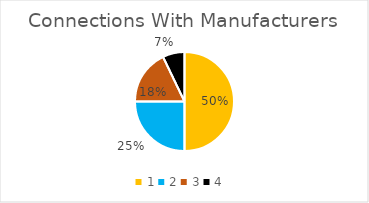
| Category | Series 0 |
|---|---|
| 0 | 0.5 |
| 1 | 0.25 |
| 2 | 0.179 |
| 3 | 0.071 |